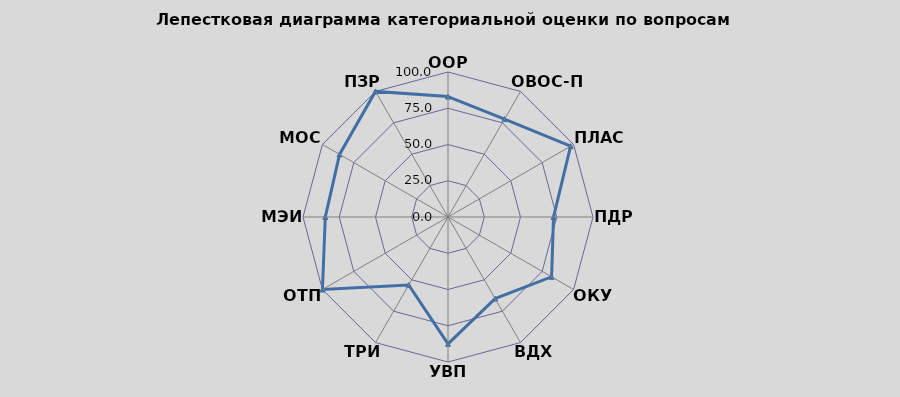
| Category | B2 |
|---|---|
| ООР | 83.036 |
| ОВОС-ПЗ | 78 |
| ПЛАС | 97.656 |
| ПДР | 72.794 |
| ОКУ | 82.5 |
| ВДХ | 65 |
| УВП | 87.5 |
| ТРИ | 54.167 |
| ОТП | 100 |
| МЭИ | 84.615 |
| MОС | 86.364 |
| ПЗР | 100 |